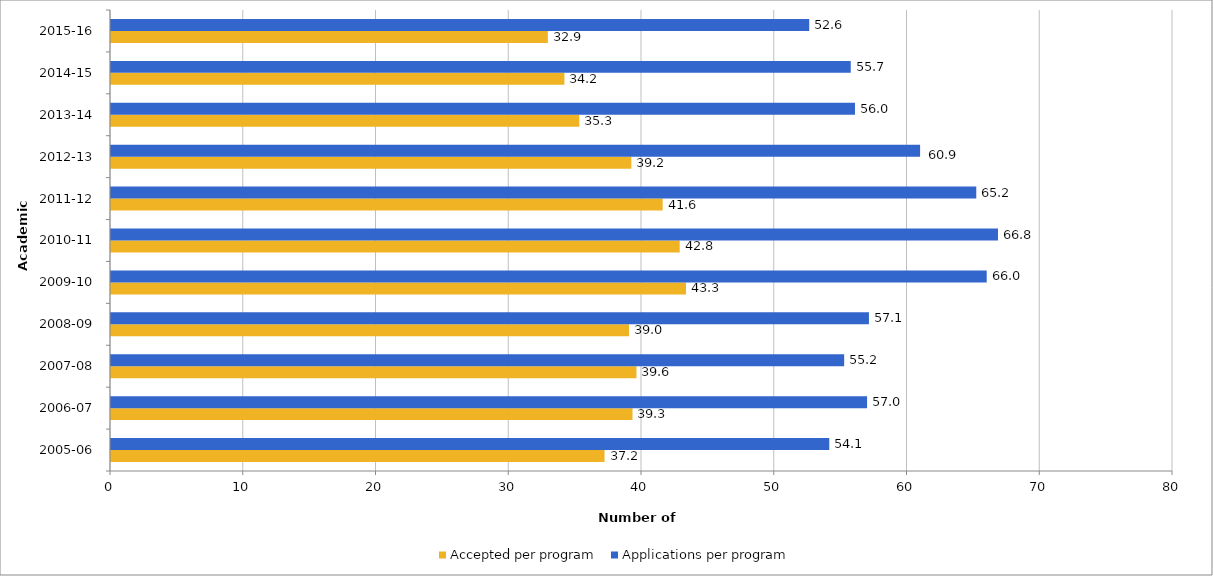
| Category | Accepted per program | Applications per program |
|---|---|---|
| 2005-06 | 37.177 | 54.107 |
| 2006-07 | 39.284 | 56.955 |
| 2007-08 | 39.583 | 55.229 |
| 2008-09 | 39.022 | 57.096 |
| 2009-10 | 43.314 | 65.968 |
| 2010-11 | 42.839 | 66.817 |
| 2011-12 | 41.557 | 65.181 |
| 2012-13 | 39.198 | 60.95 |
| 2013-14 | 35.275 | 56.044 |
| 2014-15 | 34.154 | 55.724 |
| 2015-16 | 32.909 | 52.597 |